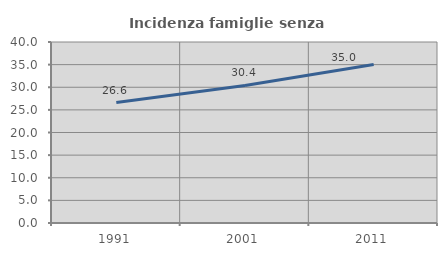
| Category | Incidenza famiglie senza nuclei |
|---|---|
| 1991.0 | 26.628 |
| 2001.0 | 30.403 |
| 2011.0 | 35.039 |